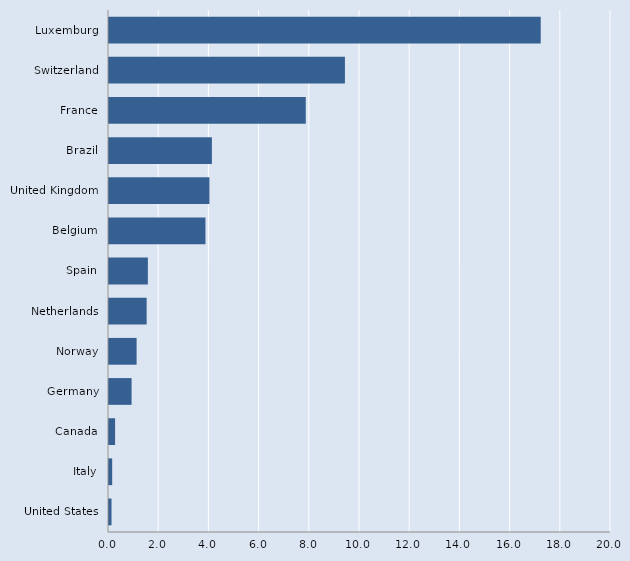
| Category | Series 0 |
|---|---|
| United States | 0.1 |
| Italy | 0.127 |
| Canada | 0.243 |
| Germany | 0.9 |
| Norway | 1.1 |
| Netherlands | 1.5 |
| Spain | 1.549 |
| Belgium | 3.843 |
| United Kingdom | 4 |
| Brazil | 4.1 |
| France | 7.84 |
| Switzerland | 9.4 |
| Luxemburg | 17.2 |